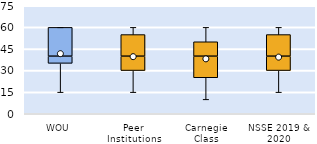
| Category | 25th | 50th | 75th |
|---|---|---|---|
| WOU | 35 | 5 | 20 |
| Peer Institutions | 30 | 10 | 15 |
| Carnegie Class | 25 | 15 | 10 |
| NSSE 2019 & 2020 | 30 | 10 | 15 |